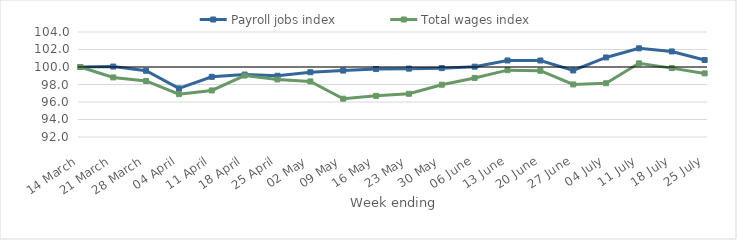
| Category | Payroll jobs index | Total wages index |
|---|---|---|
| 2020-03-14 | 100 | 100 |
| 2020-03-21 | 100.051 | 98.809 |
| 2020-03-28 | 99.57 | 98.405 |
| 2020-04-04 | 97.553 | 96.901 |
| 2020-04-11 | 98.877 | 97.32 |
| 2020-04-18 | 99.137 | 99.024 |
| 2020-04-25 | 98.995 | 98.579 |
| 2020-05-02 | 99.402 | 98.352 |
| 2020-05-09 | 99.589 | 96.376 |
| 2020-05-16 | 99.765 | 96.703 |
| 2020-05-23 | 99.813 | 96.938 |
| 2020-05-30 | 99.87 | 97.977 |
| 2020-06-06 | 100.038 | 98.752 |
| 2020-06-13 | 100.748 | 99.64 |
| 2020-06-20 | 100.74 | 99.575 |
| 2020-06-27 | 99.604 | 98.007 |
| 2020-07-04 | 101.091 | 98.144 |
| 2020-07-11 | 102.134 | 100.418 |
| 2020-07-18 | 101.778 | 99.873 |
| 2020-07-25 | 100.801 | 99.268 |